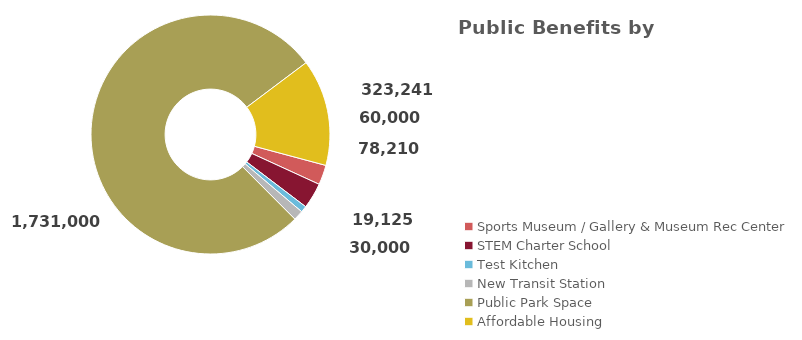
| Category | Series 0 |
|---|---|
| Sports Museum / Gallery & Museum Rec Center | 60000 |
| STEM Charter School | 78210 |
| Test Kitchen | 19125 |
| New Transit Station | 30000 |
| Public Park Space | 1731000 |
| Affordable Housing | 323241.015 |